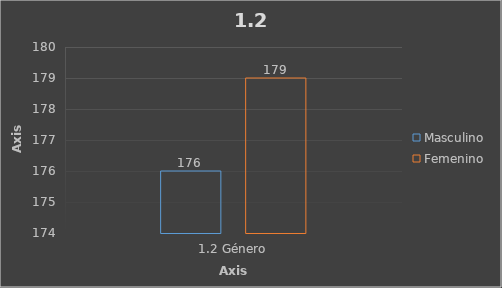
| Category | Masculino | Femenino |
|---|---|---|
| 1.2 Género | 176 | 179 |